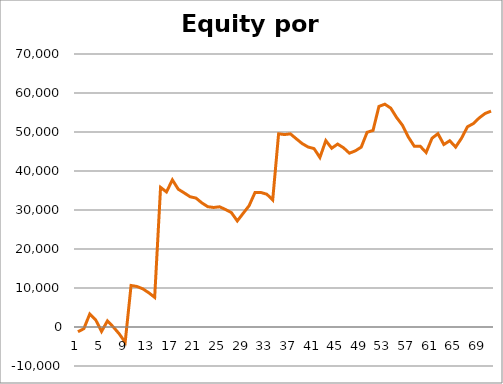
| Category | Series 0 |
|---|---|
| 0 | -1220 |
| 1 | -432.5 |
| 2 | 3330 |
| 3 | 1842.5 |
| 4 | -1137.5 |
| 5 | 1572.5 |
| 6 | -7.5 |
| 7 | -1767.5 |
| 8 | -3917.5 |
| 9 | 10638.8 |
| 10 | 10388.8 |
| 11 | 9778.8 |
| 12 | 8778.8 |
| 13 | 7597.55 |
| 14 | 35807.55 |
| 15 | 34627.55 |
| 16 | 37727.55 |
| 17 | 35327.55 |
| 18 | 34387.55 |
| 19 | 33397.55 |
| 20 | 33057.55 |
| 21 | 31817.55 |
| 22 | 30847.55 |
| 23 | 30647.55 |
| 24 | 30822.55 |
| 25 | 30132.55 |
| 26 | 29332.55 |
| 27 | 27192.55 |
| 28 | 29152.55 |
| 29 | 31102.55 |
| 30 | 34477.55 |
| 31 | 34490.05 |
| 32 | 34046.25 |
| 33 | 32586.25 |
| 34 | 49536.25 |
| 35 | 49346.25 |
| 36 | 49521.25 |
| 37 | 48258.75 |
| 38 | 47027.5 |
| 39 | 46147.5 |
| 40 | 45747.5 |
| 41 | 43467.5 |
| 42 | 47792.5 |
| 43 | 45836.25 |
| 44 | 46906.25 |
| 45 | 45956.25 |
| 46 | 44566.25 |
| 47 | 45166.25 |
| 48 | 46116.25 |
| 49 | 49926.25 |
| 50 | 50401.25 |
| 51 | 56556.25 |
| 52 | 57126.25 |
| 53 | 56126.25 |
| 54 | 53706.25 |
| 55 | 51699.95 |
| 56 | 48674.95 |
| 57 | 46324.95 |
| 58 | 46344.95 |
| 59 | 44744.95 |
| 60 | 48407.45 |
| 61 | 49567.45 |
| 62 | 46792.45 |
| 63 | 47762.45 |
| 64 | 46137.45 |
| 65 | 48417.45 |
| 66 | 51337.45 |
| 67 | 52162.45 |
| 68 | 53612.45 |
| 69 | 54749.95 |
| 70 | 55359.95 |